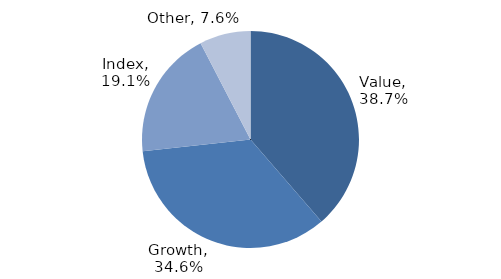
| Category | Investment Style |
|---|---|
| Value | 0.387 |
| Growth | 0.346 |
| Index | 0.191 |
| Other | 0.076 |